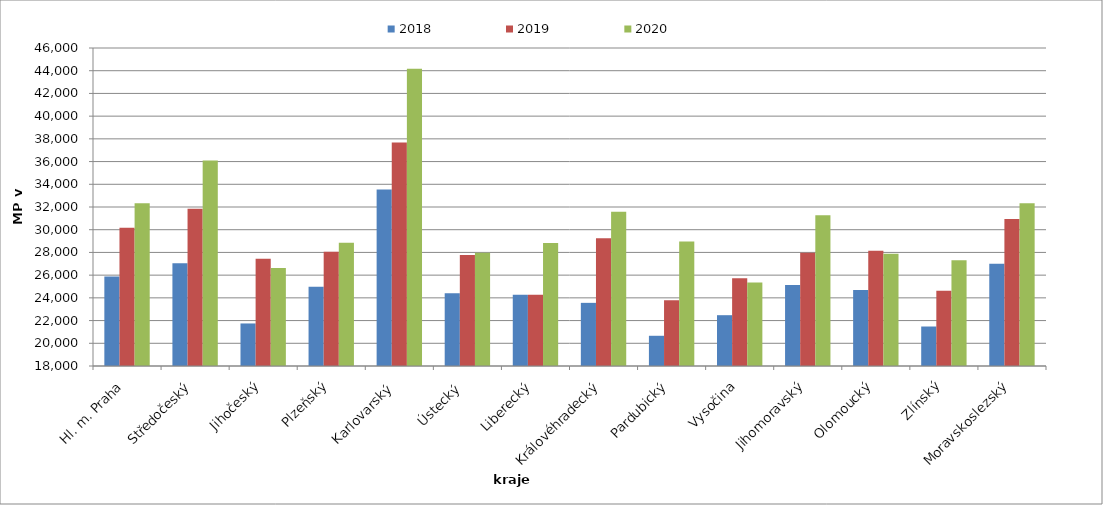
| Category | 2018 | 2019 | 2020 |
|---|---|---|---|
| Hl. m. Praha | 25873.866 | 30171.109 | 32323.498 |
| Středočeský | 27053.525 | 31839.591 | 36093.476 |
| Jihočeský | 21745.744 | 27440.206 | 26630.39 |
| Plzeňský | 24969.059 | 28056.79 | 28857.812 |
| Karlovarský  | 33547.126 | 37673.563 | 44180 |
| Ústecký   | 24398.74 | 27763.139 | 27967.948 |
| Liberecký | 24273.023 | 24273.023 | 28834.429 |
| Královéhradecký | 23560.042 | 29239.003 | 31572.743 |
| Pardubický | 20660.566 | 23793.196 | 28960.093 |
| Vysočina | 22473.874 | 25718.784 | 25349.39 |
| Jihomoravský | 25142.808 | 27964.977 | 31270.259 |
| Olomoucký | 24698.933 | 28148.967 | 27890.799 |
| Zlínský | 21477.305 | 24635.271 | 27302.017 |
| Moravskoslezský | 27013.567 | 30937.072 | 32323.779 |